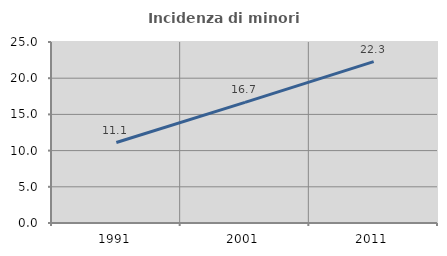
| Category | Incidenza di minori stranieri |
|---|---|
| 1991.0 | 11.111 |
| 2001.0 | 16.667 |
| 2011.0 | 22.295 |